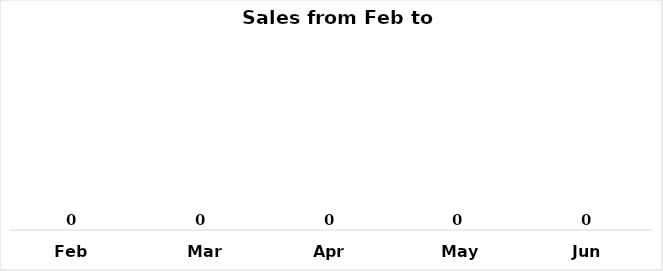
| Category | Sales (units) |
|---|---|
| Feb | 500 |
| Mar | 713 |
| Apr | 700 |
| May | 650 |
| Jun | 620 |